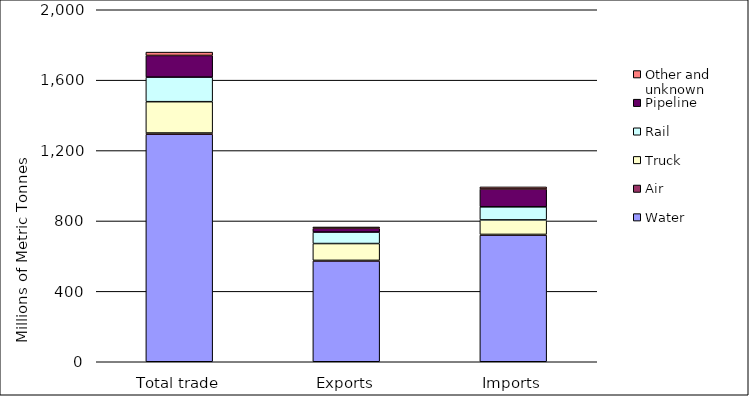
| Category | Water | Air | Truck | Rail | Pipeline | Other and unknown |
|---|---|---|---|---|---|---|
| Total trade | 1292.552 | 7.152 | 178.008 | 139.522 | 123.005 | 19.13 |
| Exports | 572.716 | 3.357 | 95.562 | 65.295 | 21.526 | 7.269 |
| Imports | 719.775 | 3.719 | 82.446 | 74.227 | 101.479 | 11.861 |